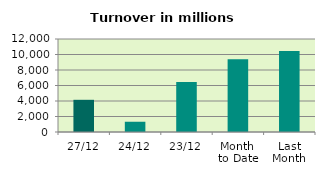
| Category | Series 0 |
|---|---|
| 27/12 | 4154.169 |
| 24/12 | 1322.928 |
| 23/12 | 6440.928 |
| Month 
to Date | 9376.302 |
| Last
Month | 10449.431 |